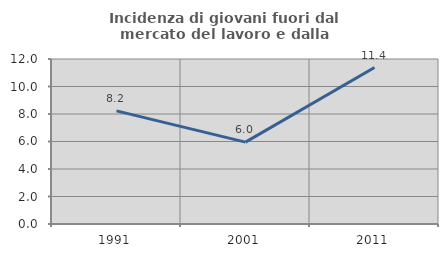
| Category | Incidenza di giovani fuori dal mercato del lavoro e dalla formazione  |
|---|---|
| 1991.0 | 8.225 |
| 2001.0 | 5.952 |
| 2011.0 | 11.377 |